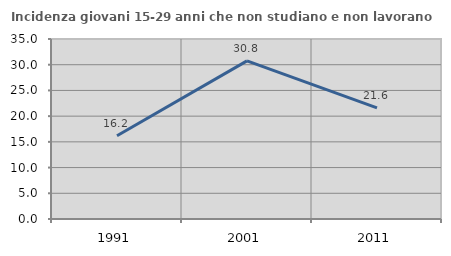
| Category | Incidenza giovani 15-29 anni che non studiano e non lavorano  |
|---|---|
| 1991.0 | 16.194 |
| 2001.0 | 30.753 |
| 2011.0 | 21.6 |